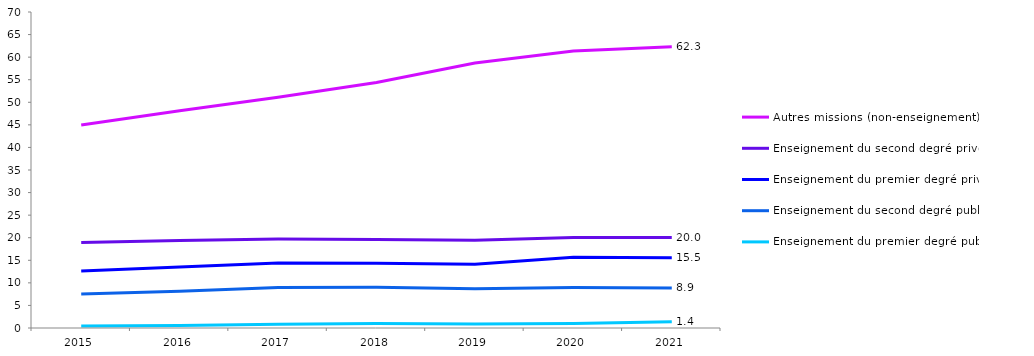
| Category | Autres missions (non-enseignement) | Enseignement du second degré privé | Enseignement du premier degré privé | Enseignement du second degré public | Enseignement du premier degré public |
|---|---|---|---|---|---|
| 2015.0 | 44.986 | 18.925 | 12.623 | 7.542 | 0.419 |
| 2016.0 | 48.139 | 19.4 | 13.488 | 8.125 | 0.572 |
| 2017.0 | 51.099 | 19.727 | 14.381 | 8.951 | 0.807 |
| 2018.0 | 54.398 | 19.592 | 14.331 | 9.05 | 0.973 |
| 2019.0 | 58.712 | 19.455 | 14.132 | 8.679 | 0.863 |
| 2020.0 | 61.368 | 20.056 | 15.683 | 8.972 | 1.016 |
| 2021.0 | 62.312 | 20.027 | 15.549 | 8.885 | 1.371 |